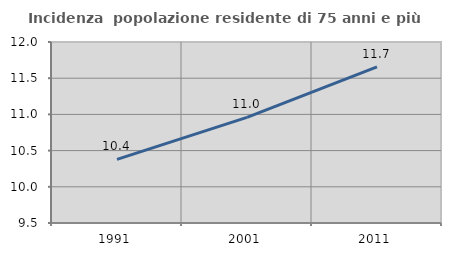
| Category | Incidenza  popolazione residente di 75 anni e più |
|---|---|
| 1991.0 | 10.38 |
| 2001.0 | 10.959 |
| 2011.0 | 11.656 |